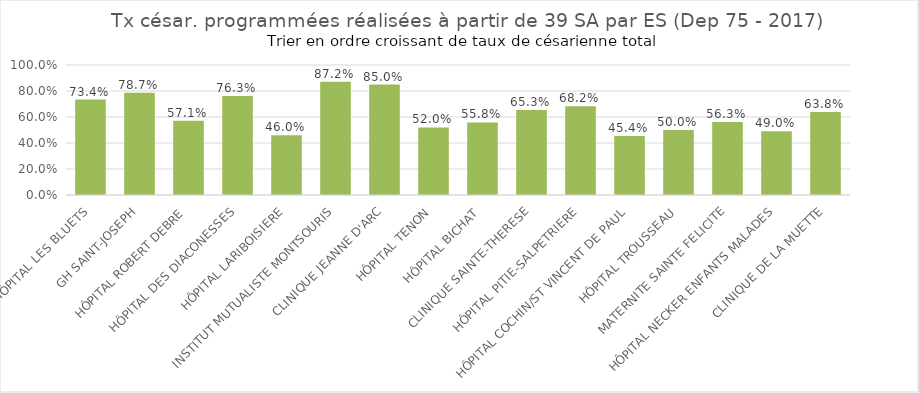
| Category | Tx césar. programmées 
réalisées à partir de 39 SA |
|---|---|
| HÔPITAL LES BLUETS | 0.734 |
| GH SAINT-JOSEPH | 0.787 |
| HÔPITAL ROBERT DEBRE | 0.571 |
| HÔPITAL DES DIACONESSES | 0.762 |
| HÔPITAL LARIBOISIERE | 0.46 |
| INSTITUT MUTUALISTE MONTSOURIS | 0.872 |
| CLINIQUE JEANNE D'ARC | 0.85 |
| HÔPITAL TENON | 0.52 |
| HÔPITAL BICHAT | 0.558 |
| CLINIQUE SAINTE-THERESE | 0.653 |
| HÔPITAL PITIE-SALPETRIERE | 0.682 |
| HÔPITAL COCHIN/ST VINCENT DE PAUL | 0.454 |
| HÔPITAL TROUSSEAU | 0.5 |
| MATERNITE SAINTE FELICITE | 0.562 |
| HÔPITAL NECKER ENFANTS MALADES | 0.49 |
| CLINIQUE DE LA MUETTE | 0.638 |